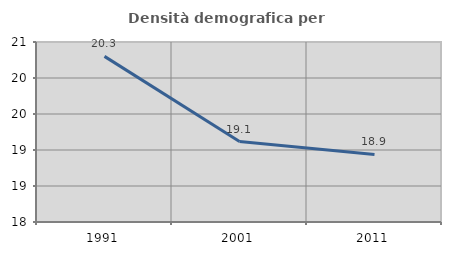
| Category | Densità demografica |
|---|---|
| 1991.0 | 20.3 |
| 2001.0 | 19.117 |
| 2011.0 | 18.938 |